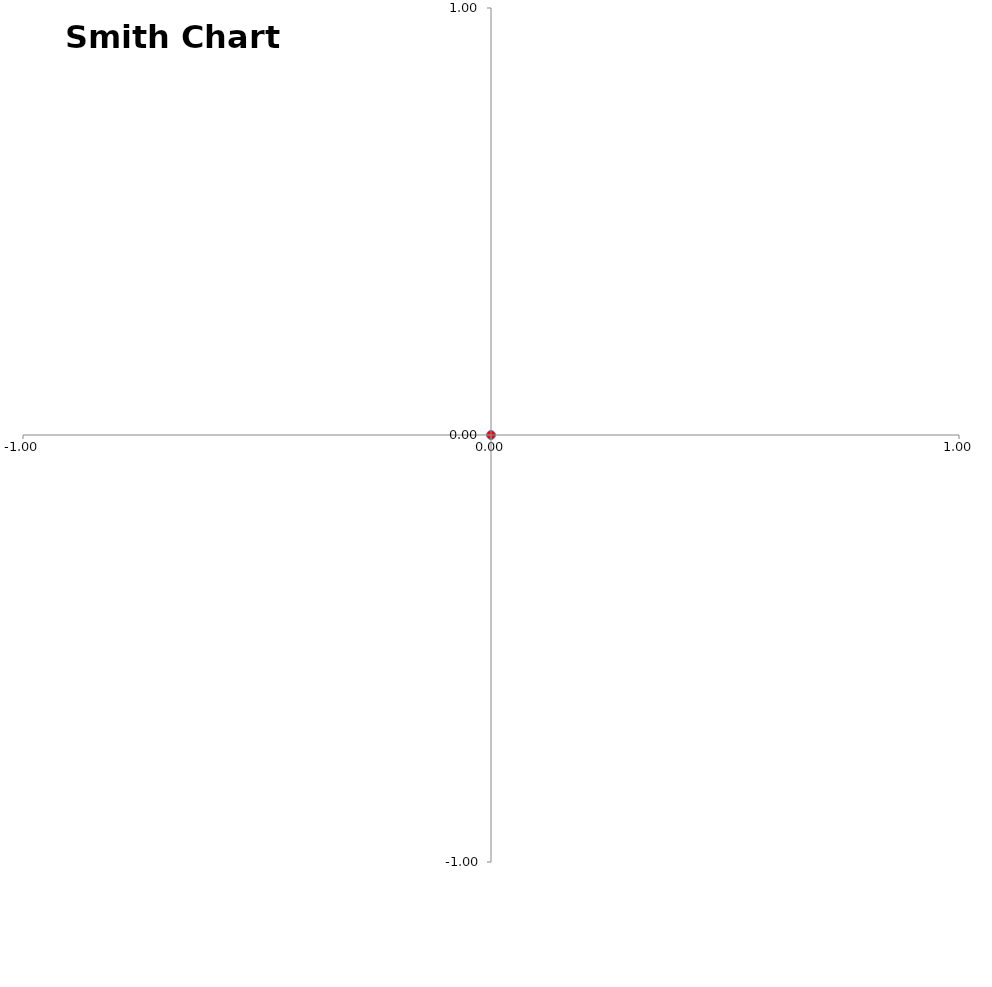
| Category | Gamma Value |
|---|---|
| 0.0 | 0 |